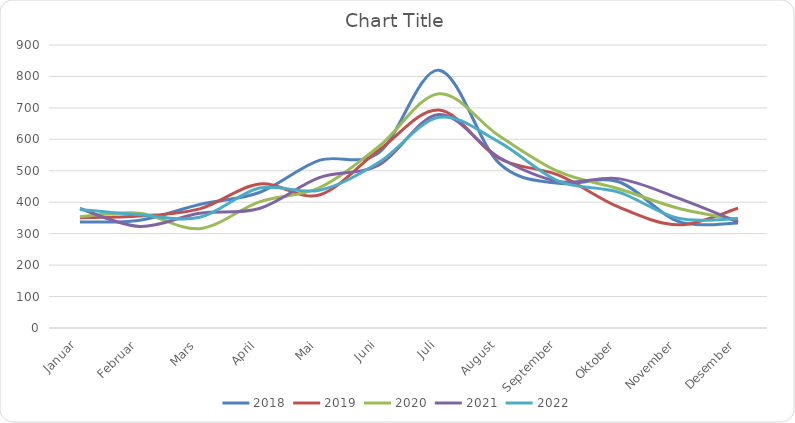
| Category | 2018 | 2019 | 2020 | 2021 | 2022 |
|---|---|---|---|---|---|
| Januar | 337 | 351 | 354 | 380 | 377 |
| Februar | 343 | 356 | 365 | 323 | 360 |
| Mars | 393 | 379 | 316 | 365 | 352 |
| April | 431 | 458 | 401 | 380 | 445 |
| Mai | 533 | 423 | 446 | 478 | 438 |
| Juni | 558 | 566 | 578 | 519 | 527 |
| Juli | 820 | 693 | 745 | 679 | 670 |
| August | 525 | 540 | 612 | 543 | 592 |
| September | 460 | 486 | 497 | 466 | 467 |
| Oktober | 465 | 385 | 443 | 475 | 432 |
| November | 339 | 328 | 381 | 413 | 349 |
| Desember | 334 | 381 | 344 | 337 | 348 |